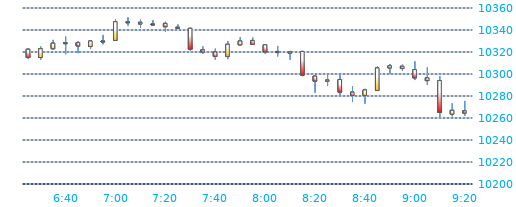
| Category | Series 0 | Series 1 | Series 2 | Series 3 |
|---|---|---|---|---|
| 2016-04-26 09:20:00 | 10266.5 | 10275.5 | 10262 | 10264.5 |
| 2016-04-26 09:15:00 | 10263.5 | 10273.5 | 10261.5 | 10267 |
| 2016-04-26 09:10:00 | 10294 | 10298 | 10260 | 10265 |
| 2016-04-26 09:05:00 | 10296.5 | 10306 | 10290 | 10294 |
| 2016-04-26 09:00:00 | 10304 | 10311.5 | 10294.5 | 10296.5 |
| 2016-04-26 08:55:00 | 10307 | 10308.5 | 10303 | 10305 |
| 2016-04-26 08:50:00 | 10305.5 | 10309 | 10300 | 10307.5 |
| 2016-04-26 08:45:00 | 10285 | 10307 | 10285 | 10305.5 |
| 2016-04-26 08:40:00 | 10280.5 | 10286.5 | 10273 | 10285.5 |
| 2016-04-26 08:35:00 | 10283.5 | 10289 | 10274.5 | 10280.5 |
| 2016-04-26 08:30:00 | 10295 | 10299 | 10280.5 | 10283.5 |
| 2016-04-26 08:25:00 | 10293.5 | 10299 | 10289 | 10294.5 |
| 2016-04-26 08:20:00 | 10298 | 10299 | 10283 | 10293.5 |
| 2016-04-26 08:15:00 | 10320.5 | 10320.5 | 10298 | 10299 |
| 2016-04-26 08:10:00 | 10319 | 10321 | 10313 | 10320 |
| 2016-04-26 08:05:00 | 10320.5 | 10325.5 | 10316 | 10319.5 |
| 2016-04-26 08:00:00 | 10326.5 | 10326.5 | 10318.5 | 10320 |
| 2016-04-26 07:55:00 | 10330.5 | 10333 | 10326.5 | 10327 |
| 2016-04-26 07:50:00 | 10326.5 | 10333.5 | 10326.5 | 10330 |
| 2016-04-26 07:45:00 | 10316 | 10330 | 10313.5 | 10327 |
| 2016-04-26 07:40:00 | 10320 | 10323 | 10313 | 10316 |
| 2016-04-26 07:35:00 | 10322 | 10325 | 10318.5 | 10320 |
| 2016-04-26 07:30:00 | 10341.5 | 10341.5 | 10321 | 10322.5 |
| 2016-04-26 07:25:00 | 10342.5 | 10345 | 10341 | 10342 |
| 2016-04-26 07:20:00 | 10346 | 10347.5 | 10338.5 | 10343 |
| 2016-04-26 07:15:00 | 10345.5 | 10349 | 10344 | 10345.5 |
| 2016-04-26 07:10:00 | 10347 | 10349.5 | 10342 | 10345.5 |
| 2016-04-26 07:05:00 | 10347.5 | 10351.5 | 10344 | 10347 |
| 2016-04-26 07:00:00 | 10330.5 | 10350 | 10330 | 10347.5 |
| 2016-04-26 06:55:00 | 10330 | 10335.5 | 10327 | 10330 |
| 2016-04-26 06:50:00 | 10325 | 10330.5 | 10323 | 10330 |
| 2016-04-26 06:45:00 | 10328.5 | 10330 | 10319 | 10325.5 |
| 2016-04-26 06:40:00 | 10328.5 | 10334 | 10318 | 10328 |
| 2016-04-26 06:35:00 | 10323 | 10331 | 10322 | 10328 |
| 2016-04-26 06:30:00 | 10315 | 10325 | 10313 | 10323 |
| 2016-04-26 06:25:00 | 10322.5 | 10323.5 | 10313.5 | 10315 |